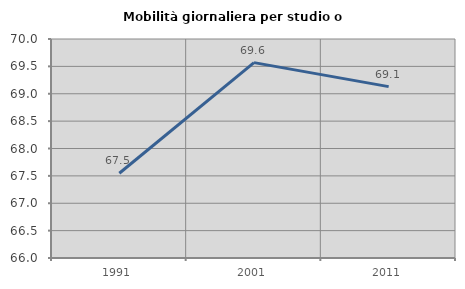
| Category | Mobilità giornaliera per studio o lavoro |
|---|---|
| 1991.0 | 67.549 |
| 2001.0 | 69.569 |
| 2011.0 | 69.13 |